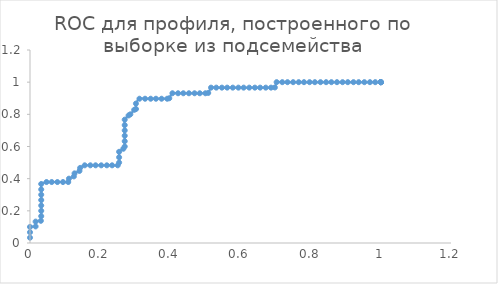
| Category | Series 0 |
|---|---|
| 0.0 | 0.033 |
| 0.0 | 0.067 |
| 0.0 | 0.1 |
| 0.016 | 0.103 |
| 0.016 | 0.133 |
| 0.031 | 0.138 |
| 0.032 | 0.167 |
| 0.032 | 0.2 |
| 0.032 | 0.233 |
| 0.032 | 0.267 |
| 0.032 | 0.3 |
| 0.032 | 0.333 |
| 0.032 | 0.367 |
| 0.047 | 0.379 |
| 0.062 | 0.379 |
| 0.0779999999999999 | 0.379 |
| 0.0939999999999999 | 0.379 |
| 0.109 | 0.379 |
| 0.111 | 0.4 |
| 0.125 | 0.414 |
| 0.127 | 0.433 |
| 0.141 | 0.448 |
| 0.143 | 0.467 |
| 0.156 | 0.483 |
| 0.172 | 0.483 |
| 0.187 | 0.483 |
| 0.203 | 0.483 |
| 0.219 | 0.483 |
| 0.234 | 0.483 |
| 0.25 | 0.483 |
| 0.254 | 0.5 |
| 0.254 | 0.533 |
| 0.254 | 0.567 |
| 0.266 | 0.586 |
| 0.27 | 0.6 |
| 0.27 | 0.633 |
| 0.27 | 0.667 |
| 0.27 | 0.7 |
| 0.27 | 0.733 |
| 0.27 | 0.767 |
| 0.281 | 0.793 |
| 0.286 | 0.8 |
| 0.297 | 0.828 |
| 0.302 | 0.833 |
| 0.302 | 0.867 |
| 0.312 | 0.897 |
| 0.328 | 0.897 |
| 0.344 | 0.897 |
| 0.359 | 0.897 |
| 0.375 | 0.897 |
| 0.391 | 0.897 |
| 0.397 | 0.9 |
| 0.406 | 0.931 |
| 0.422 | 0.931 |
| 0.437 | 0.931 |
| 0.453 | 0.931 |
| 0.469 | 0.931 |
| 0.484 | 0.931 |
| 0.5 | 0.931 |
| 0.508 | 0.933 |
| 0.516 | 0.966 |
| 0.531 | 0.966 |
| 0.547 | 0.966 |
| 0.562 | 0.966 |
| 0.578 | 0.966 |
| 0.594 | 0.966 |
| 0.609 | 0.966 |
| 0.625 | 0.966 |
| 0.641 | 0.966 |
| 0.656 | 0.966 |
| 0.672 | 0.966 |
| 0.687 | 0.966 |
| 0.698 | 0.967 |
| 0.703 | 1 |
| 0.719 | 1 |
| 0.734 | 1 |
| 0.75 | 1 |
| 0.766 | 1 |
| 0.781 | 1 |
| 0.797 | 1 |
| 0.812 | 1 |
| 0.828 | 1 |
| 0.844 | 1 |
| 0.859 | 1 |
| 0.875 | 1 |
| 0.891 | 1 |
| 0.906 | 1 |
| 0.922 | 1 |
| 0.937 | 1 |
| 0.953 | 1 |
| 0.969 | 1 |
| 0.984 | 1 |
| 1.0 | 1 |
| 1.0 | 1 |
| 1.0 | 1 |
| 1.0 | 1 |
| 1.0 | 1 |
| 1.0 | 1 |
| 1.0 | 1 |